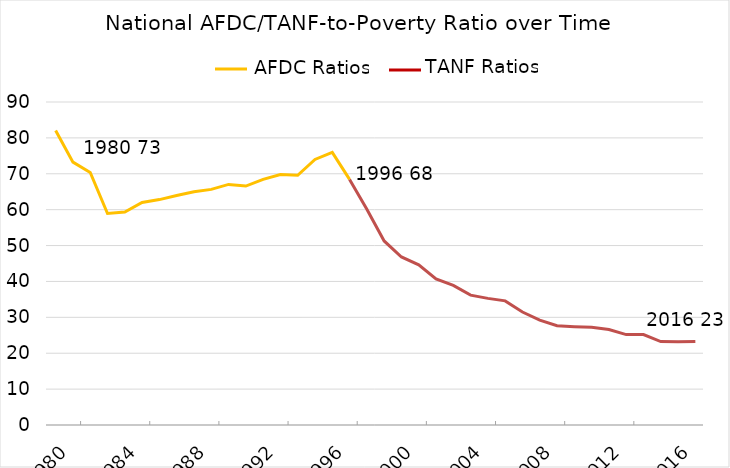
| Category | Series 0 |
|---|---|
| nan | 82.061 |
| 1980.0 | 73.245 |
| nan | 70.38 |
| nan | 58.928 |
| nan | 59.329 |
| 1984.0 | 62.017 |
| nan | 62.807 |
| nan | 63.968 |
| nan | 65.007 |
| 1988.0 | 65.658 |
| nan | 67.032 |
| nan | 66.57 |
| nan | 68.428 |
| 1992.0 | 69.77 |
| nan | 69.573 |
| nan | 73.982 |
| nan | 75.967 |
| 1996.0 | 68.434 |
| nan | 60.107 |
| nan | 51.281 |
| nan | 46.815 |
| 2000.0 | 44.625 |
| nan | 40.721 |
| nan | 38.883 |
| nan | 36.191 |
| 2004.0 | 35.279 |
| nan | 34.584 |
| nan | 31.487 |
| nan | 29.231 |
| 2008.0 | 27.663 |
| nan | 27.409 |
| nan | 27.258 |
| nan | 26.626 |
| 2012.0 | 25.192 |
| nan | 25.183 |
| nan | 23.248 |
| nan | 23.188 |
| 2016.0 | 23.299 |